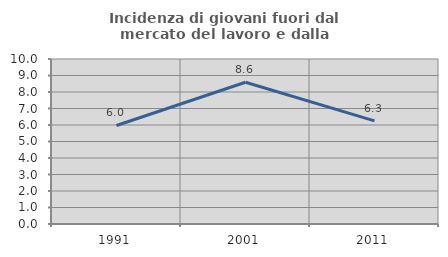
| Category | Incidenza di giovani fuori dal mercato del lavoro e dalla formazione  |
|---|---|
| 1991.0 | 5.97 |
| 2001.0 | 8.594 |
| 2011.0 | 6.25 |